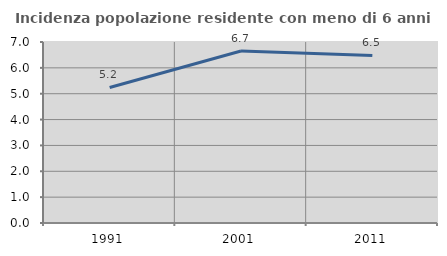
| Category | Incidenza popolazione residente con meno di 6 anni |
|---|---|
| 1991.0 | 5.242 |
| 2001.0 | 6.651 |
| 2011.0 | 6.479 |